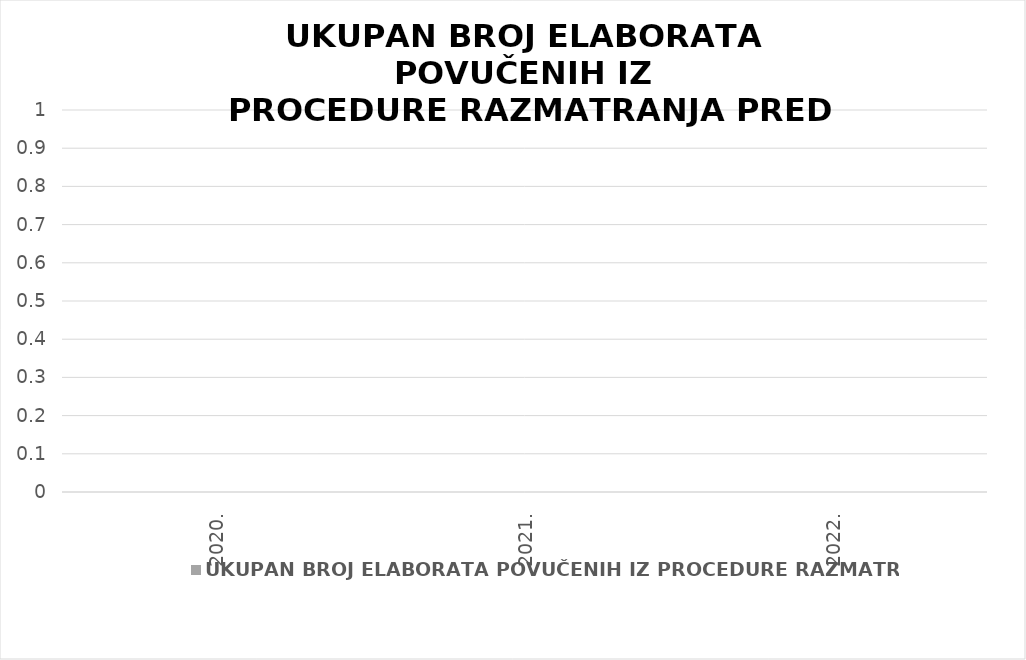
| Category | UKUPAN BROJ ELABORATA POVUČENIH IZ PROCEDURE RAZMATRANJA |
|---|---|
| 2020. | 0 |
| 2021. | 0 |
| 2022. | 0 |